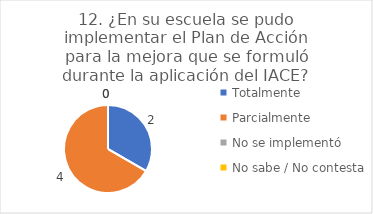
| Category | 12. ¿En su escuela se pudo implementar el Plan de Acción para la mejora que se formuló durante la aplicación del IACE? |
|---|---|
| Totalmente  | 0.333 |
| Parcialmente  | 0.667 |
| No se implementó  | 0 |
| No sabe / No contesta | 0 |